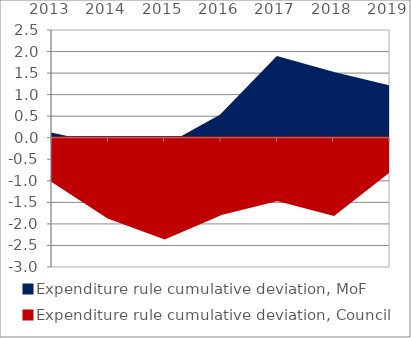
| Category | Expenditure rule cumulative deviation, MoF | Expenditure rule cumulative deviation, Council |
|---|---|---|
| 2013.0 | 0.081 | -0.993 |
| 2014.0 | -0.204 | -1.842 |
| 2015.0 | -0.218 | -2.322 |
| 2016.0 | 0.51 | -1.759 |
| 2017.0 | 1.86 | -1.432 |
| 2018.0 | 1.492 | -1.777 |
| 2019.0 | 1.175 | -0.757 |